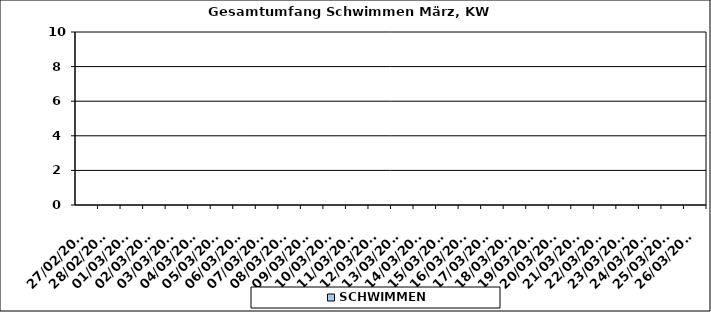
| Category | SCHWIMMEN |
|---|---|
| 27/02/2023 | 0 |
| 28/02/2023 | 0 |
| 01/03/2023 | 0 |
| 02/03/2023 | 0 |
| 03/03/2023 | 0 |
| 04/03/2023 | 0 |
| 05/03/2023 | 0 |
| 06/03/2023 | 0 |
| 07/03/2023 | 0 |
| 08/03/2023 | 0 |
| 09/03/2023 | 0 |
| 10/03/2023 | 0 |
| 11/03/2023 | 0 |
| 12/03/2023 | 0 |
| 13/03/2023 | 0 |
| 14/03/2023 | 0 |
| 15/03/2023 | 0 |
| 16/03/2023 | 0 |
| 17/03/2023 | 0 |
| 18/03/2023 | 0 |
| 19/03/2023 | 0 |
| 20/03/2023 | 0 |
| 21/03/2023 | 0 |
| 22/03/2023 | 0 |
| 23/03/2023 | 0 |
| 24/03/2023 | 0 |
| 25/03/2023 | 0 |
| 26/03/2023 | 0 |